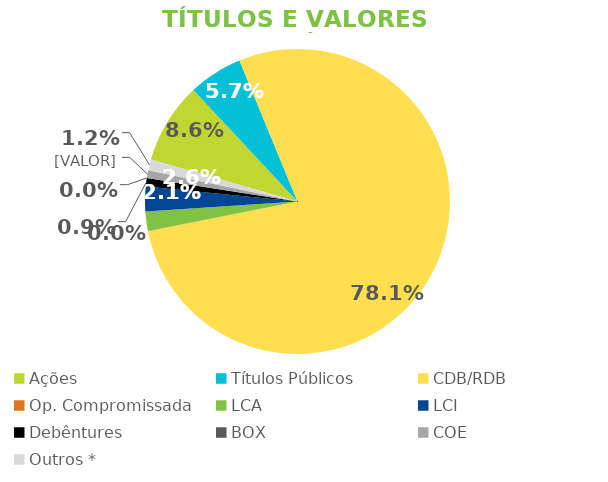
| Category | TVM |
|---|---|
| Ações | 0.086 |
| Títulos Públicos | 0.057 |
| CDB/RDB | 0.781 |
| Op. Compromissada | 0 |
| LCA | 0.021 |
| LCI | 0.026 |
| Debêntures | 0.009 |
| BOX | 0 |
| COE | 0.008 |
| Outros * | 0.012 |